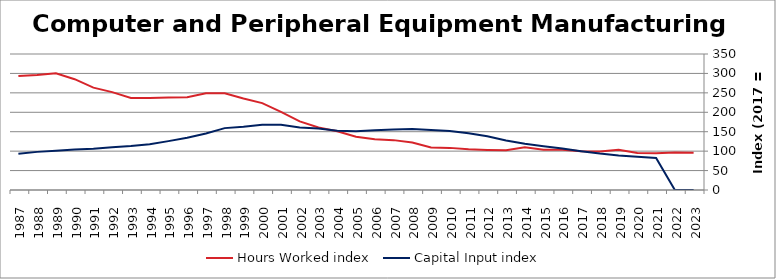
| Category | Hours Worked index | Capital Input index |
|---|---|---|
| 2023.0 | 95.679 | 0 |
| 2022.0 | 96.767 | 0 |
| 2021.0 | 94.512 | 82.404 |
| 2020.0 | 95.282 | 85.437 |
| 2019.0 | 103.637 | 88.981 |
| 2018.0 | 99.189 | 93.656 |
| 2017.0 | 100 | 100 |
| 2016.0 | 103.72 | 106.713 |
| 2015.0 | 103.306 | 112.734 |
| 2014.0 | 109.823 | 118.839 |
| 2013.0 | 102.506 | 127.34 |
| 2012.0 | 103.25 | 138.236 |
| 2011.0 | 104.977 | 146.126 |
| 2010.0 | 108.406 | 152.046 |
| 2009.0 | 109.217 | 154.608 |
| 2008.0 | 122.388 | 156.737 |
| 2007.0 | 128.346 | 155.383 |
| 2006.0 | 130.629 | 153.787 |
| 2005.0 | 136.921 | 151.453 |
| 2004.0 | 151.033 | 152.381 |
| 2003.0 | 160.871 | 158.482 |
| 2002.0 | 176.644 | 161.072 |
| 2001.0 | 200.869 | 167.973 |
| 2000.0 | 223.557 | 168.205 |
| 1999.0 | 235.413 | 162.877 |
| 1998.0 | 248.753 | 159.254 |
| 1997.0 | 248.751 | 145.274 |
| 1996.0 | 238.674 | 134.291 |
| 1995.0 | 238.086 | 125.746 |
| 1994.0 | 236.899 | 117.722 |
| 1993.0 | 236.738 | 113.293 |
| 1992.0 | 251.856 | 110.304 |
| 1991.0 | 263.427 | 106.439 |
| 1990.0 | 285.158 | 104.085 |
| 1989.0 | 300.638 | 101.247 |
| 1988.0 | 296.056 | 98.122 |
| 1987.0 | 293.353 | 93.085 |